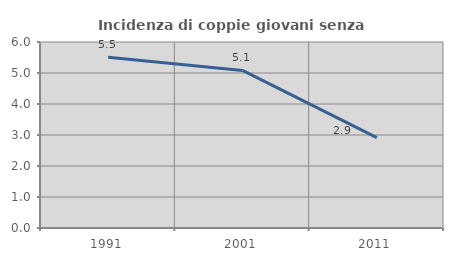
| Category | Incidenza di coppie giovani senza figli |
|---|---|
| 1991.0 | 5.506 |
| 2001.0 | 5.082 |
| 2011.0 | 2.917 |